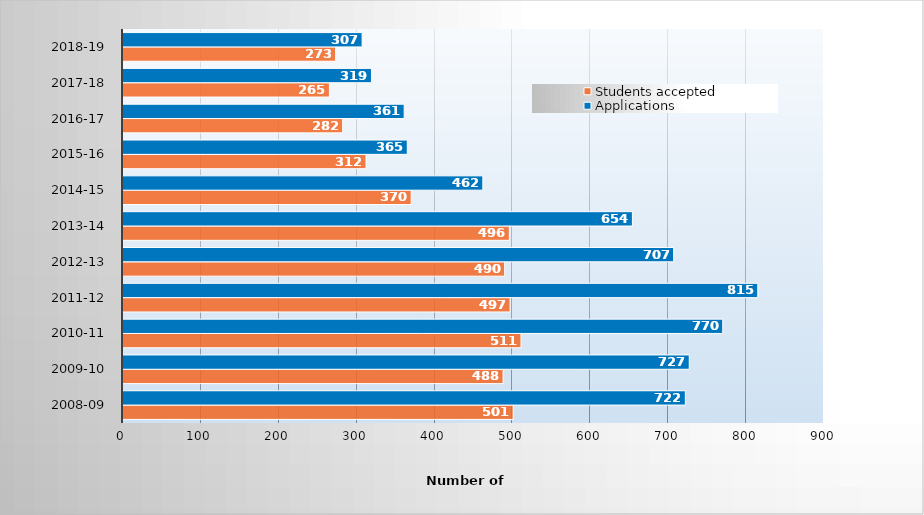
| Category | Students accepted | Applications |
|---|---|---|
| 2008-09 | 501 | 722 |
| 2009-10 | 488 | 727 |
| 2010-11 | 511 | 770 |
| 2011-12 | 497 | 815 |
| 2012-13 | 490 | 707 |
| 2013-14 | 496 | 654 |
| 2014-15 | 370 | 462 |
| 2015-16 | 312 | 365 |
| 2016-17 | 282 | 361 |
| 2017-18 | 265 | 319 |
| 2018-19 | 273 | 307 |